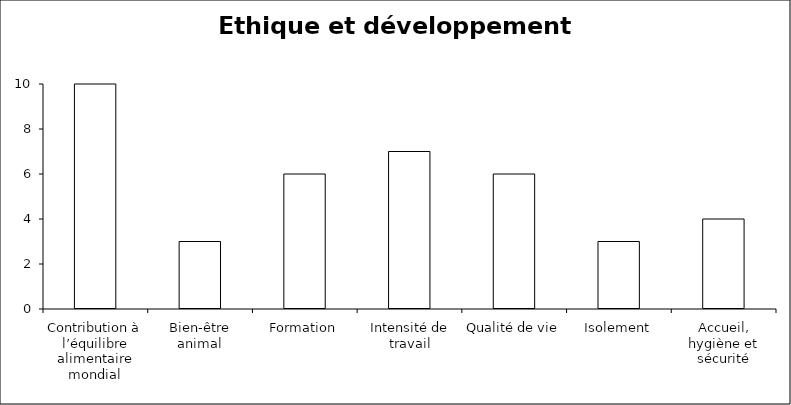
| Category | Series 0 | Series 1 |
|---|---|---|
| Contribution à l’équilibre alimentaire mondial | 0 | 10 |
| Bien-être animal | 0 | 3 |
| Formation | 0 | 6 |
| Intensité de travail | 0 | 7 |
| Qualité de vie | 0 | 6 |
| Isolement | 0 | 3 |
| Accueil, hygiène et sécurité | 0 | 4 |